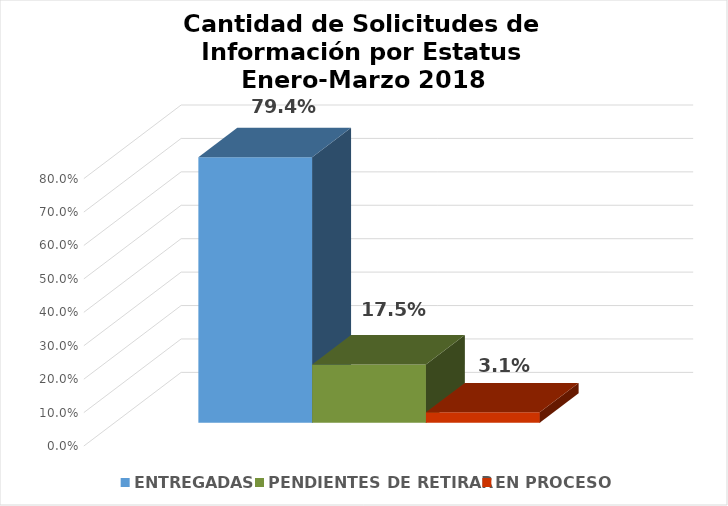
| Category | ENTREGADAS | PENDIENTES DE RETIRAR | EN PROCESO |
|---|---|---|---|
|  | 0.794 | 0.175 | 0.031 |